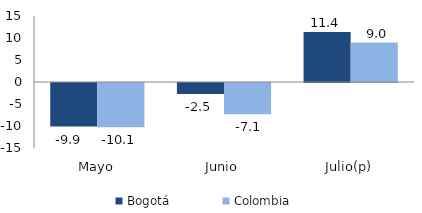
| Category | Bogotá | Colombia |
|---|---|---|
| Mayo | -9.907 | -10.077 |
| Junio | -2.484 | -7.092 |
| Julio(p) | 11.389 | 8.958 |